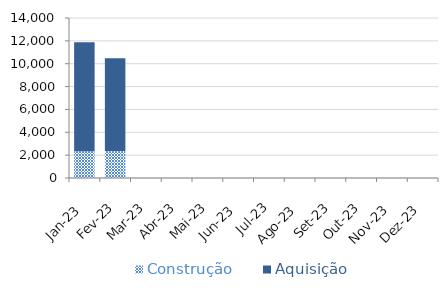
| Category | Construção | Aquisição  |
|---|---|---|
| Jan-23 | 2346.378 | 9533.602 |
| Fev-23 | 2352.975 | 8126 |
| Mar-23 | 0 | 0 |
| Abr-23 | 0 | 0 |
| Mai-23 | 0 | 0 |
| Jun-23 | 0 | 0 |
| Jul-23 | 0 | 0 |
| Ago-23 | 0 | 0 |
| Set-23 | 0 | 0 |
| Out-23 | 0 | 0 |
| Nov-23 | 0 | 0 |
| Dez-23 | 0 | 0 |